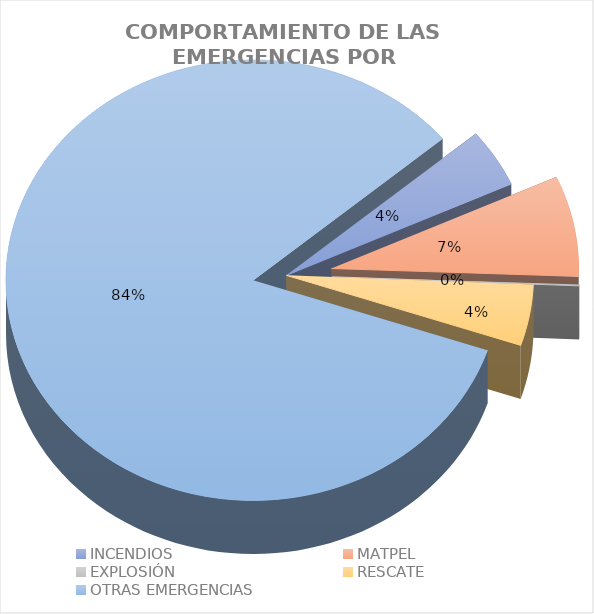
| Category | Incidentes |
|---|---|
| INCENDIOS | 0.043 |
| MATPEL | 0.074 |
| EXPLOSIÓN | 0.001 |
| RESCATE | 0.045 |
| OTRAS EMERGENCIAS | 0.837 |